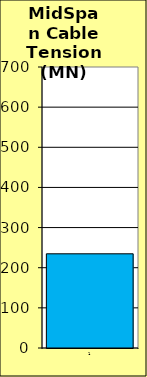
| Category | Series 0 |
|---|---|
| 0 | 234.667 |